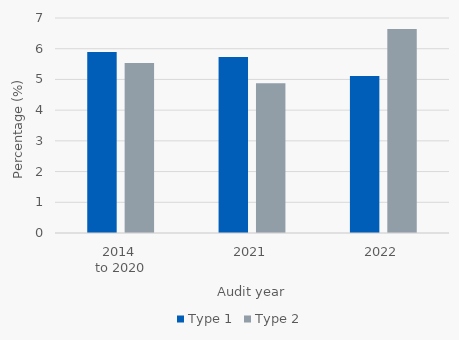
| Category | Type 1 | Type 2 |
|---|---|---|
| 2014 
to 2020 | 5.889 | 5.535 |
| 2021 | 5.734 | 4.873 |
| 2022 | 5.111 | 6.644 |